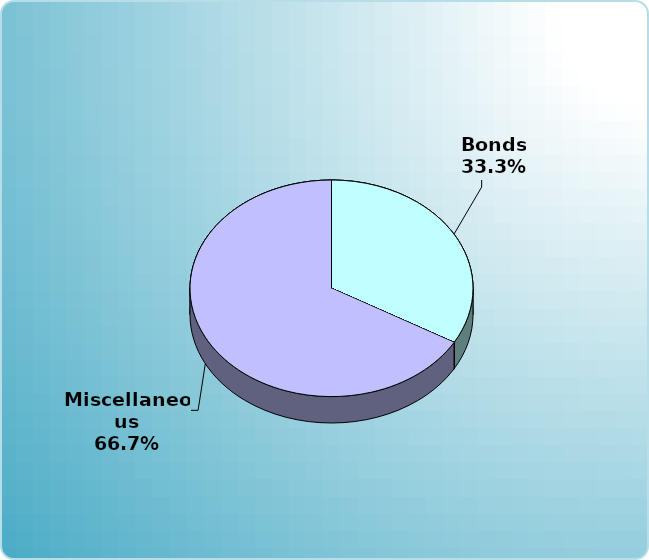
| Category | Series 0 |
|---|---|
| Cash | 0 |
| Bonds | 25000 |
| Muni Bond | 0 |
| Hybrid bond | 0 |
| Value | 0 |
| Growth | 0 |
| Small-Cap | 0 |
| Tangibles | 0 |
| International | 0 |
| Personal Property | 0 |
| Miscellaneous | 50000 |